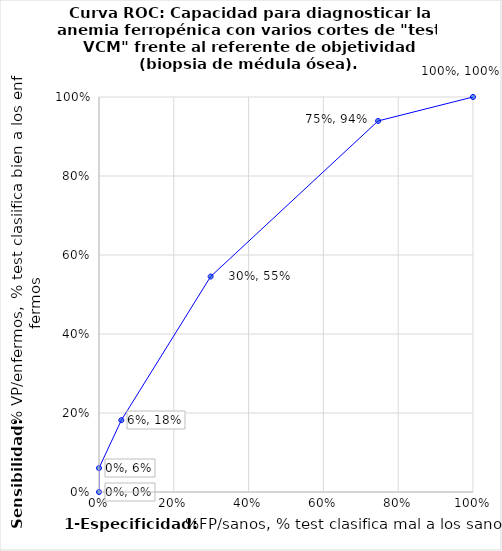
| Category | Sensibilidad |
|---|---|
| 1.0 | 1 |
| 0.7462686567164178 | 0.939 |
| 0.29850746268656714 | 0.545 |
| 0.05970149253731338 | 0.182 |
| 0.0 | 0.061 |
| 0.0 | 0 |